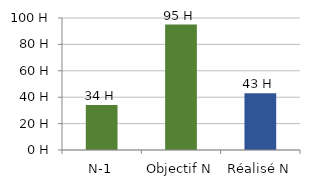
| Category | Series 0 |
|---|---|
| N-1 | 34 |
| Objectif N | 95 |
| Réalisé N | 43 |